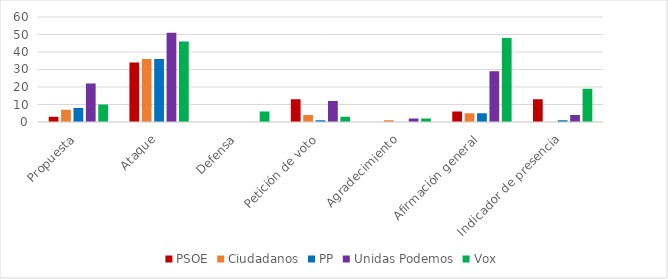
| Category | PSOE | Ciudadanos | PP | Unidas Podemos | Vox |
|---|---|---|---|---|---|
| Propuesta | 3 | 7 | 8 | 22 | 10 |
| Ataque | 34 | 36 | 36 | 51 | 46 |
| Defensa | 0 | 0 | 0 | 0 | 6 |
| Petición de voto | 13 | 4 | 1 | 12 | 3 |
| Agradecimiento | 0 | 1 | 0 | 2 | 2 |
| Afirmación general | 6 | 5 | 5 | 29 | 48 |
| Indicador de presencia | 13 | 0 | 1 | 4 | 19 |